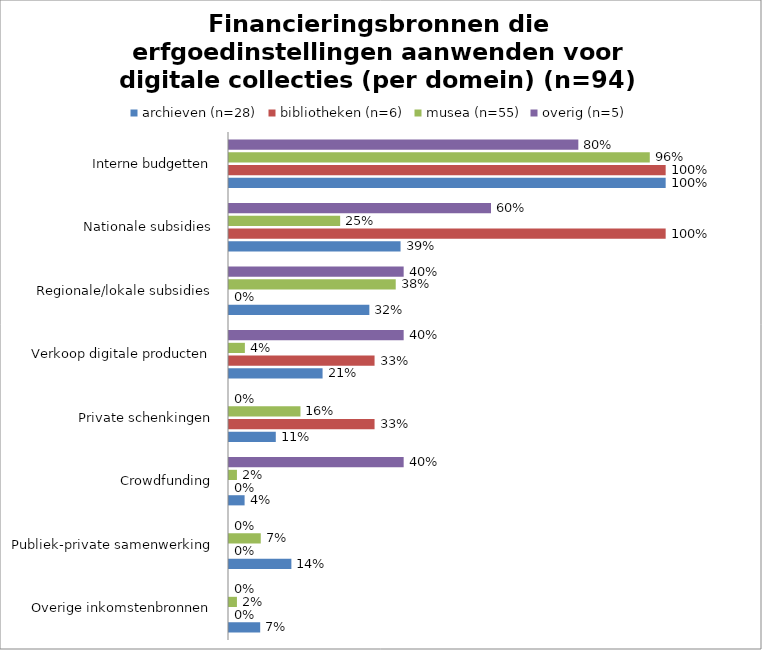
| Category | archieven (n=28) | bibliotheken (n=6) | musea (n=55) | overig (n=5) |
|---|---|---|---|---|
| Overige inkomstenbronnen | 0.071 | 0 | 0.018 | 0 |
| Publiek-private samenwerking | 0.143 | 0 | 0.073 | 0 |
| Crowdfunding | 0.036 | 0 | 0.018 | 0.4 |
| Private schenkingen | 0.107 | 0.333 | 0.164 | 0 |
| Verkoop digitale producten | 0.214 | 0.333 | 0.036 | 0.4 |
| Regionale/lokale subsidies | 0.321 | 0 | 0.382 | 0.4 |
| Nationale subsidies | 0.393 | 1 | 0.255 | 0.6 |
| Interne budgetten | 1 | 1 | 0.964 | 0.8 |